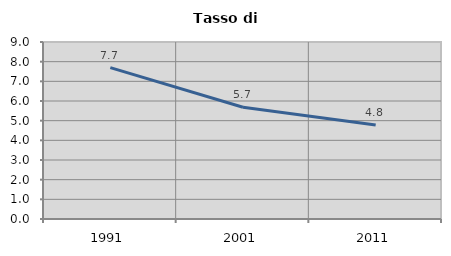
| Category | Tasso di disoccupazione   |
|---|---|
| 1991.0 | 7.697 |
| 2001.0 | 5.683 |
| 2011.0 | 4.774 |